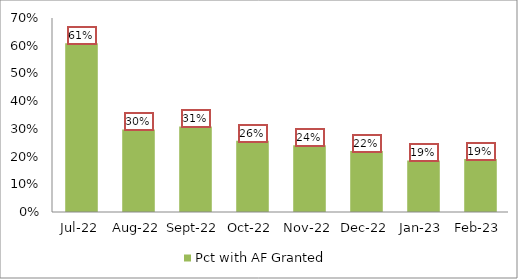
| Category | Pct with AF Granted |
|---|---|
| 2022-07-22 | 0.608 |
| 2022-08-31 | 0.298 |
| 2022-09-30 | 0.309 |
| 2022-10-31 | 0.257 |
| 2022-11-30 | 0.241 |
| 2022-12-31 | 0.22 |
| 2023-01-31 | 0.186 |
| 2023-02-23 | 0.191 |